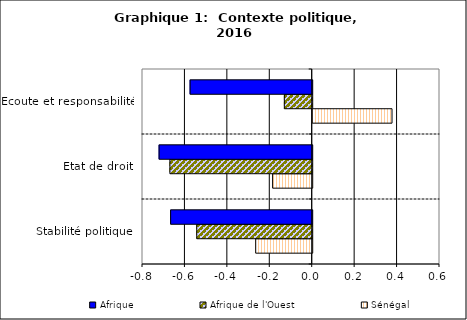
| Category | Sénégal | Afrique de l'Ouest | Afrique |
|---|---|---|---|
| Stabilité politique | -0.266 | -0.544 | -0.667 |
| Etat de droit | -0.187 | -0.671 | -0.722 |
| Ecoute et responsabilité | 0.374 | -0.131 | -0.576 |